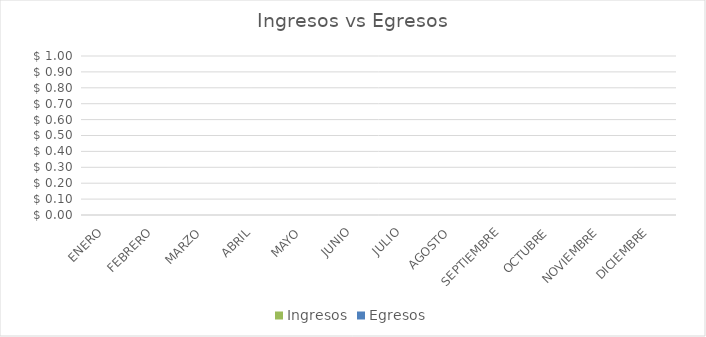
| Category | Ingresos | Egresos |
|---|---|---|
| ENERO | 0 | 0 |
| FEBRERO | 0 | 0 |
| MARZO | 0 | 0 |
| ABRIL | 0 | 0 |
| MAYO | 0 | 0 |
| JUNIO | 0 | 0 |
| JULIO | 0 | 0 |
| AGOSTO | 0 | 0 |
| SEPTIEMBRE | 0 | 0 |
| OCTUBRE | 0 | 0 |
| NOVIEMBRE | 0 | 0 |
| DICIEMBRE | 0 | 0 |